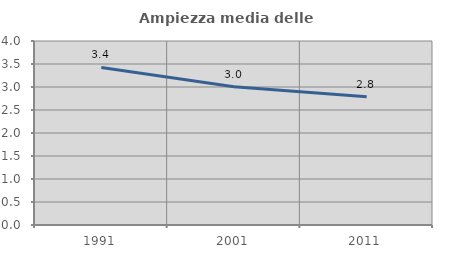
| Category | Ampiezza media delle famiglie |
|---|---|
| 1991.0 | 3.426 |
| 2001.0 | 3.007 |
| 2011.0 | 2.788 |